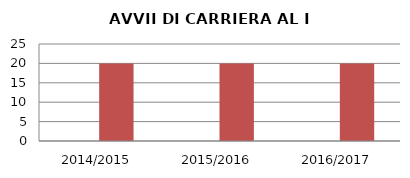
| Category | ANNO | NUMERO |
|---|---|---|
| 2014/2015 | 0 | 20 |
| 2015/2016 | 0 | 20 |
| 2016/2017 | 0 | 20 |